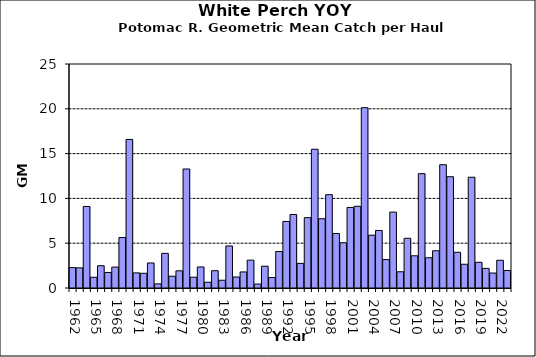
| Category | Series 0 |
|---|---|
| 1962.0 | 2.273 |
| 1963.0 | 2.249 |
| 1964.0 | 9.097 |
| 1965.0 | 1.196 |
| 1966.0 | 2.488 |
| 1967.0 | 1.737 |
| 1968.0 | 2.334 |
| 1969.0 | 5.633 |
| 1970.0 | 16.584 |
| 1971.0 | 1.686 |
| 1972.0 | 1.641 |
| 1973.0 | 2.793 |
| 1974.0 | 0.461 |
| 1975.0 | 3.868 |
| 1976.0 | 1.316 |
| 1977.0 | 1.917 |
| 1978.0 | 13.283 |
| 1979.0 | 1.208 |
| 1980.0 | 2.348 |
| 1981.0 | 0.645 |
| 1982.0 | 1.93 |
| 1983.0 | 0.868 |
| 1984.0 | 4.693 |
| 1985.0 | 1.229 |
| 1986.0 | 1.794 |
| 1987.0 | 3.111 |
| 1988.0 | 0.441 |
| 1989.0 | 2.431 |
| 1990.0 | 1.166 |
| 1991.0 | 4.075 |
| 1992.0 | 7.427 |
| 1993.0 | 8.201 |
| 1994.0 | 2.748 |
| 1995.0 | 7.853 |
| 1996.0 | 15.486 |
| 1997.0 | 7.73 |
| 1998.0 | 10.416 |
| 1999.0 | 6.088 |
| 2000.0 | 5.047 |
| 2001.0 | 8.99 |
| 2002.0 | 9.122 |
| 2003.0 | 20.123 |
| 2004.0 | 5.89 |
| 2005.0 | 6.418 |
| 2006.0 | 3.174 |
| 2007.0 | 8.468 |
| 2008.0 | 1.812 |
| 2009.0 | 5.546 |
| 2010.0 | 3.596 |
| 2011.0 | 12.761 |
| 2012.0 | 3.373 |
| 2013.0 | 4.156 |
| 2014.0 | 13.758 |
| 2015.0 | 12.419 |
| 2016.0 | 3.987 |
| 2017.0 | 2.649 |
| 2018.0 | 12.362 |
| 2019.0 | 2.864 |
| 2020.0 | 2.19 |
| 2021.0 | 1.67 |
| 2022.0 | 3.096 |
| 2023.0 | 1.956 |